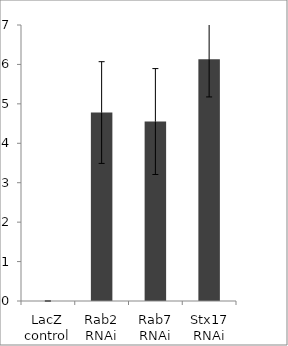
| Category | Series 0 |
|---|---|
| LacZ control | 0 |
| Rab2 RNAi | 4.78 |
| Rab7 RNAi | 4.552 |
| Stx17 RNAi | 6.134 |